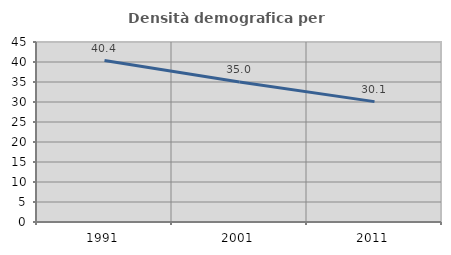
| Category | Densità demografica |
|---|---|
| 1991.0 | 40.373 |
| 2001.0 | 35.017 |
| 2011.0 | 30.098 |